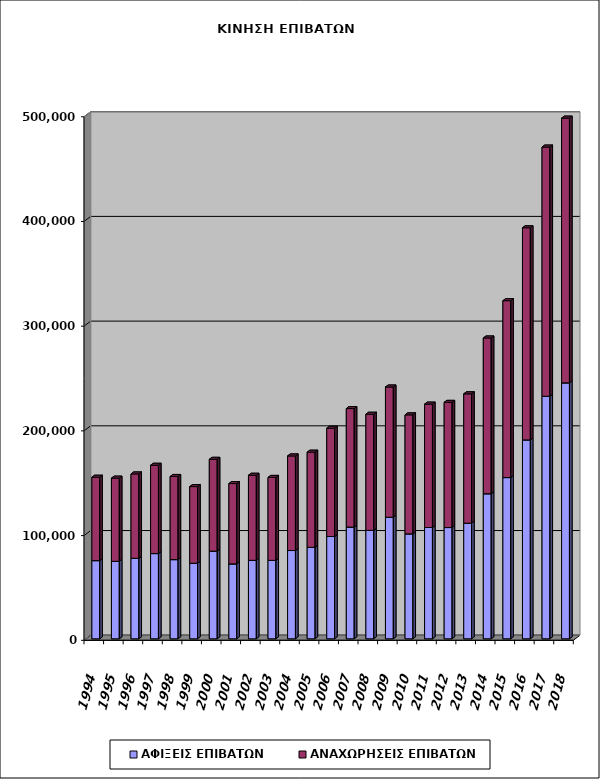
| Category | ΑΦΙΞΕΙΣ ΕΠΙΒΑΤΩΝ | ΑΝΑΧΩΡΗΣΕΙΣ ΕΠΙΒΑΤΩΝ |
|---|---|---|
| 1994.0 | 74650 | 79638 |
| 1995.0 | 74022 | 79395 |
| 1996.0 | 76857 | 80568 |
| 1997.0 | 81386 | 84333 |
| 1998.0 | 75623 | 79399 |
| 1999.0 | 72171 | 73191 |
| 2000.0 | 83700 | 87707 |
| 2001.0 | 71545 | 76712 |
| 2002.0 | 74957 | 81220 |
| 2003.0 | 74913 | 79203 |
| 2004.0 | 84291 | 90341 |
| 2005.0 | 87342 | 90856 |
| 2006.0 | 97677 | 103436 |
| 2007.0 | 106690 | 113170 |
| 2008.0 | 103580 | 110856 |
| 2009.0 | 116092 | 124369 |
| 2010.0 | 100219 | 113633 |
| 2011.0 | 106295 | 117830 |
| 2012.0 | 106254 | 119535 |
| 2013.0 | 110430 | 123519 |
| 2014.0 | 138529 | 148736 |
| 2015.0 | 153963 | 168938 |
| 2016.0 | 189963 | 202562 |
| 2017.0 | 231635 | 237961 |
| 2018.0 | 244428 | 252824 |